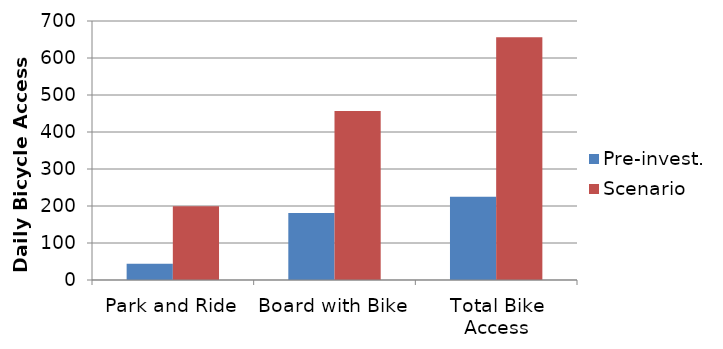
| Category | Pre-invest. | Scenario |
|---|---|---|
| Park and Ride | 43.778 | 199.452 |
| Board with Bike | 181.128 | 456.479 |
| Total Bike Access | 224.906 | 655.931 |